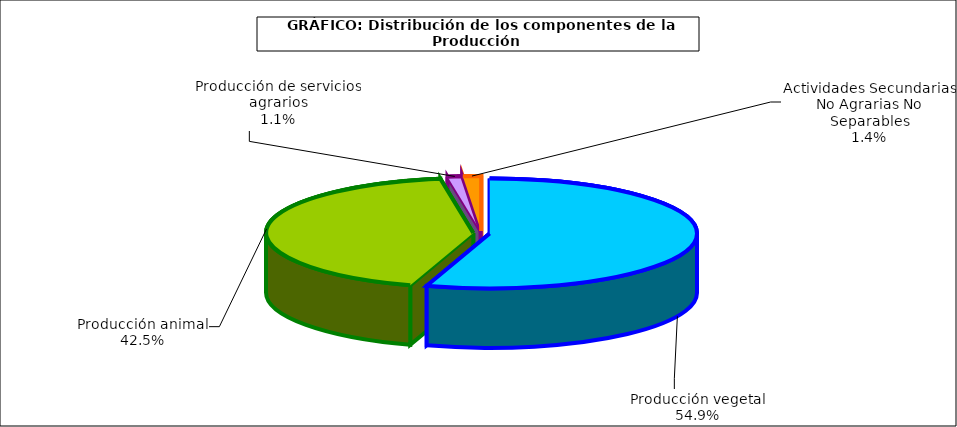
| Category | Producción rama agreria |
|---|---|
| Producción vegetal | 54.917 |
| Producción animal | 42.539 |
| Producción de servicios agrarios | 1.131 |
| Actividades Secundarias No Agrarias No Separables | 1.414 |